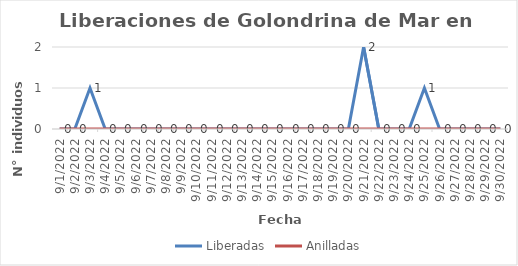
| Category | Liberadas | Anilladas |
|---|---|---|
| 9/1/22 | 0 | 0 |
| 9/2/22 | 0 | 0 |
| 9/3/22 | 1 | 0 |
| 9/4/22 | 0 | 0 |
| 9/5/22 | 0 | 0 |
| 9/6/22 | 0 | 0 |
| 9/7/22 | 0 | 0 |
| 9/8/22 | 0 | 0 |
| 9/9/22 | 0 | 0 |
| 9/10/22 | 0 | 0 |
| 9/11/22 | 0 | 0 |
| 9/12/22 | 0 | 0 |
| 9/13/22 | 0 | 0 |
| 9/14/22 | 0 | 0 |
| 9/15/22 | 0 | 0 |
| 9/16/22 | 0 | 0 |
| 9/17/22 | 0 | 0 |
| 9/18/22 | 0 | 0 |
| 9/19/22 | 0 | 0 |
| 9/20/22 | 0 | 0 |
| 9/21/22 | 2 | 0 |
| 9/22/22 | 0 | 0 |
| 9/23/22 | 0 | 0 |
| 9/24/22 | 0 | 0 |
| 9/25/22 | 1 | 0 |
| 9/26/22 | 0 | 0 |
| 9/27/22 | 0 | 0 |
| 9/28/22 | 0 | 0 |
| 9/29/22 | 0 | 0 |
| 9/30/22 | 0 | 0 |